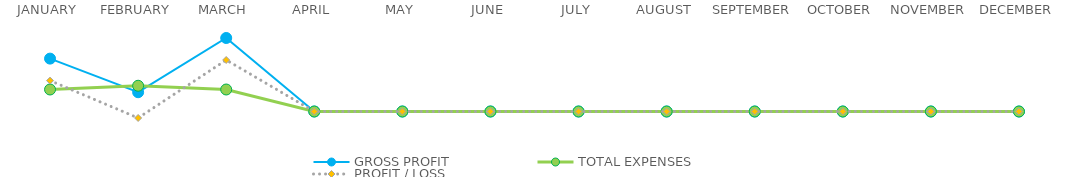
| Category | GROSS PROFIT | TOTAL EXPENSES | PROFIT / LOSS |
|---|---|---|---|
| JANUARY | 192300 | 80000 | 112300 |
| FEBRUARY | 70100 | 93600 | -23500 |
| MARCH | 267300 | 80000 | 187300 |
| APRIL | 0 | 0 | 0 |
| MAY | 0 | 0 | 0 |
| JUNE | 0 | 0 | 0 |
| JULY | 0 | 0 | 0 |
| AUGUST | 0 | 0 | 0 |
| SEPTEMBER | 0 | 0 | 0 |
| OCTOBER | 0 | 0 | 0 |
| NOVEMBER | 0 | 0 | 0 |
| DECEMBER | 0 | 0 | 0 |